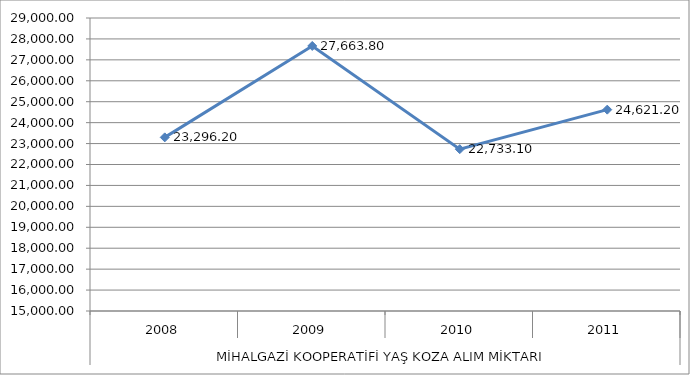
| Category | MİHALGAZİ KOOP. |
|---|---|
| 0 | 23296.2 |
| 1 | 27663.8 |
| 2 | 22733.1 |
| 3 | 24621.2 |